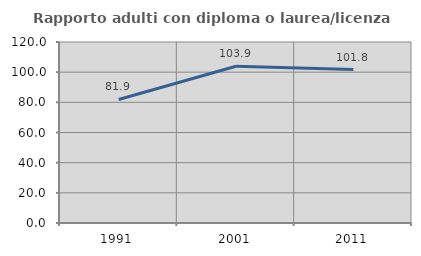
| Category | Rapporto adulti con diploma o laurea/licenza media  |
|---|---|
| 1991.0 | 81.882 |
| 2001.0 | 103.927 |
| 2011.0 | 101.765 |